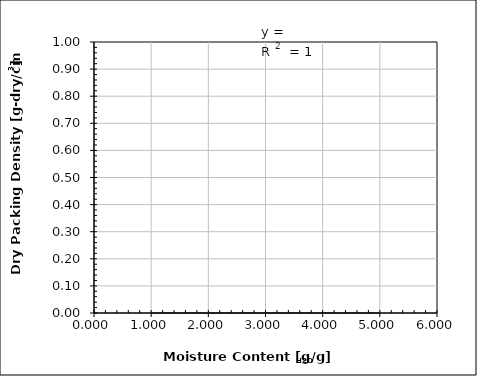
| Category | 1st Dirivative |
|---|---|
| 0 | 0 |
| 1 | 0 |
| 2 | 0 |
| 3 | 0 |
| 4 | 0 |